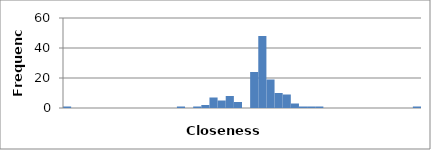
| Category | 1 |
|---|---|
| 0.0 | 1 |
| 0.00013288372093023257 | 0 |
| 0.00026576744186046513 | 0 |
| 0.00039865116279069767 | 0 |
| 0.0005315348837209303 | 0 |
| 0.0006644186046511629 | 0 |
| 0.0007973023255813955 | 0 |
| 0.000930186046511628 | 0 |
| 0.0010630697674418605 | 0 |
| 0.001195953488372093 | 0 |
| 0.0013288372093023255 | 0 |
| 0.001461720930232558 | 0 |
| 0.0015946046511627905 | 0 |
| 0.001727488372093023 | 0 |
| 0.0018603720930232554 | 1 |
| 0.001993255813953488 | 0 |
| 0.0021261395348837206 | 1 |
| 0.002259023255813953 | 2 |
| 0.0023919069767441856 | 7 |
| 0.002524790697674418 | 5 |
| 0.0026576744186046506 | 8 |
| 0.002790558139534883 | 4 |
| 0.0029234418604651155 | 0 |
| 0.003056325581395348 | 24 |
| 0.0031892093023255805 | 48 |
| 0.003322093023255813 | 19 |
| 0.0034549767441860455 | 10 |
| 0.003587860465116278 | 9 |
| 0.0037207441860465105 | 3 |
| 0.003853627906976743 | 1 |
| 0.003986511627906975 | 1 |
| 0.004119395348837208 | 1 |
| 0.00425227906976744 | 0 |
| 0.004385162790697673 | 0 |
| 0.004518046511627905 | 0 |
| 0.004650930232558138 | 0 |
| 0.00478381395348837 | 0 |
| 0.004916697674418603 | 0 |
| 0.005049581395348835 | 0 |
| 0.005182465116279068 | 0 |
| 0.0053153488372093 | 0 |
| 0.005448232558139533 | 0 |
| 0.005581116279069765 | 0 |
| 0.005714 | 1 |